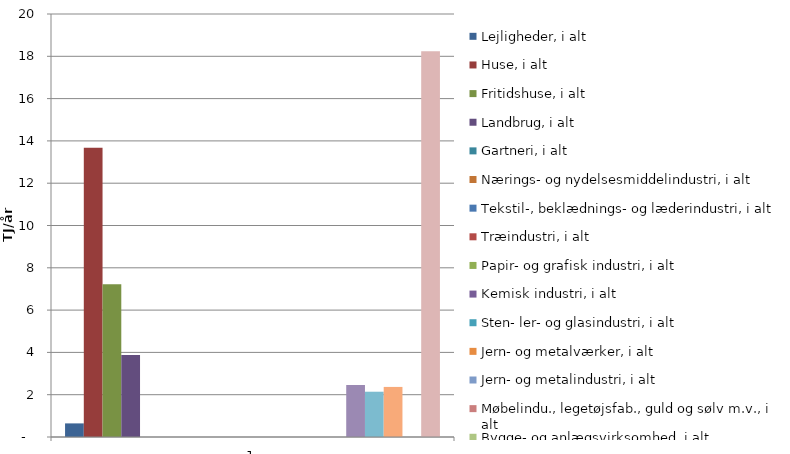
| Category | Lejligheder, i alt | Huse, i alt | Fritidshuse, i alt | Landbrug, i alt | Gartneri, i alt | Nærings- og nydelsesmiddelindustri, i alt | Tekstil-, beklædnings- og læderindustri, i alt | Træindustri, i alt | Papir- og grafisk industri, i alt | Kemisk industri, i alt | Sten- ler- og glasindustri, i alt | Jern- og metalværker, i alt | Jern- og metalindustri, i alt | Møbelindu., legetøjsfab., guld og sølv m.v., i alt | Bygge- og anlægsvirksomhed, i alt | Detail- og engroshandel, i alt | Service- og forlystelsesvirksomhed, i alt | Offentlige foretageneder, i alt | Gade- og vejbelysning, i alt | Anonymiseret og/eller ukendt |
|---|---|---|---|---|---|---|---|---|---|---|---|---|---|---|---|---|---|---|---|---|
| 0 | 0.643 | 13.676 | 7.217 | 3.878 | 0 | 0 | 0 | 0 | 0 | 0 | 0 | 0 | 0 | 0 | 0 | 2.455 | 2.141 | 2.368 | 0 | 18.239 |